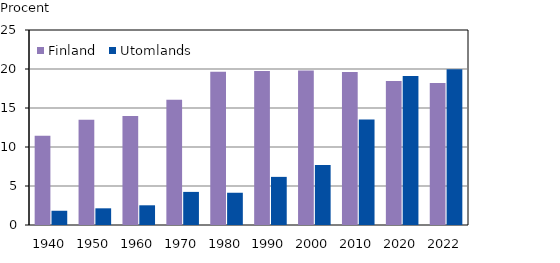
| Category | Finland  | Utomlands |
|---|---|---|
| 1940.0 | 11.455 | 1.826 |
| 1950.0 | 13.49 | 2.139 |
| 1960.0 | 13.965 | 2.526 |
| 1970.0 | 16.046 | 4.244 |
| 1980.0 | 19.651 | 4.135 |
| 1990.0 | 19.741 | 6.17 |
| 2000.0 | 19.821 | 7.701 |
| 2010.0 | 19.602 | 13.514 |
| 2020.0 | 18.467 | 19.111 |
| 2022.0 | 18.196 | 19.955 |